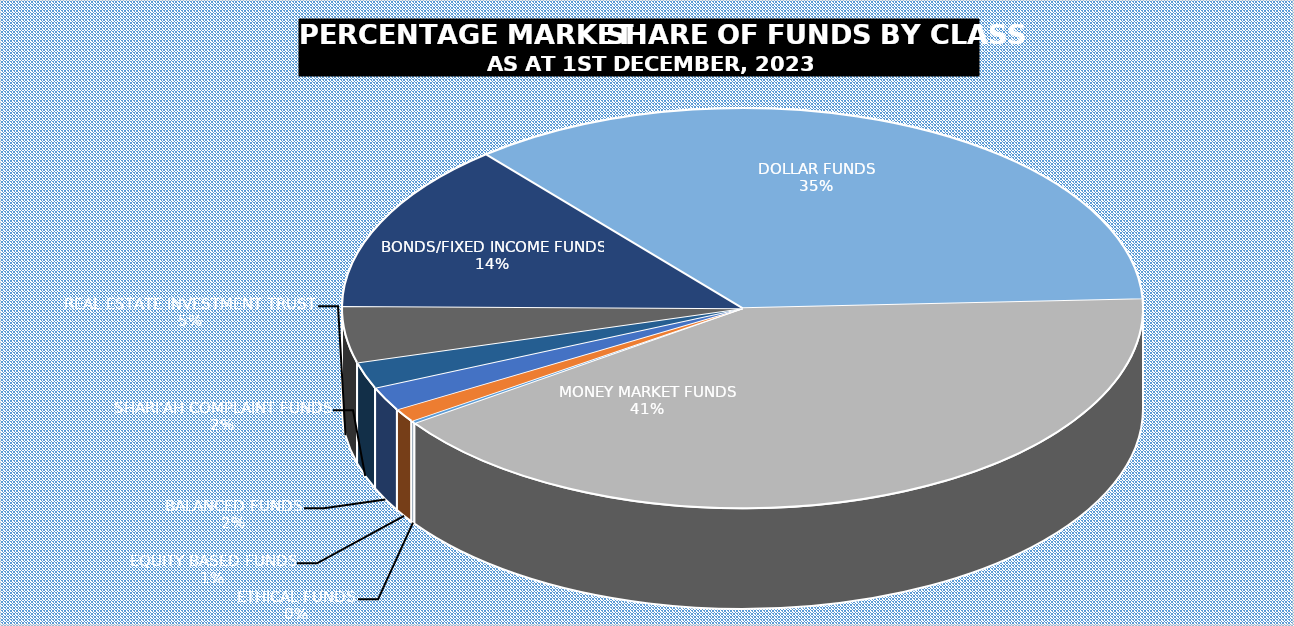
| Category | 01-Dec |
|---|---|
| ETHICAL FUNDS | 4265839491.78 |
| EQUITY BASED FUNDS | 23002842288.041 |
| BALANCED FUNDS | 40757011293.125 |
| SHARI'AH COMPLAINT FUNDS | 45253870390.85 |
| REAL ESTATE INVESTMENT TRUST | 96469811252.587 |
| BONDS/FIXED INCOME FUNDS | 291948133511.515 |
| DOLLAR FUNDS | 749487239675.219 |
| MONEY MARKET FUNDS | 869196903201.498 |